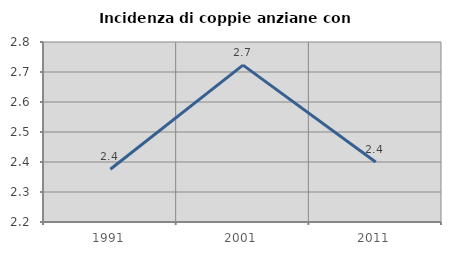
| Category | Incidenza di coppie anziane con figli |
|---|---|
| 1991.0 | 2.376 |
| 2001.0 | 2.723 |
| 2011.0 | 2.4 |